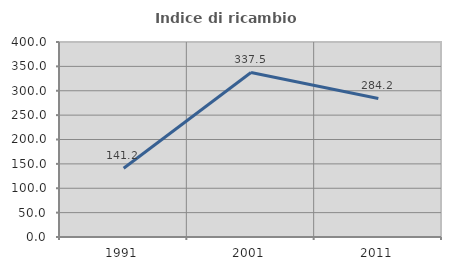
| Category | Indice di ricambio occupazionale  |
|---|---|
| 1991.0 | 141.176 |
| 2001.0 | 337.5 |
| 2011.0 | 284.211 |